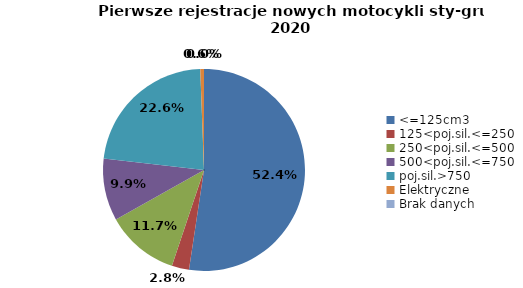
| Category | Series 0 |
|---|---|
| 0 | 11427 |
| 1 | 603 |
| 2 | 2557 |
| 3 | 2168 |
| 4 | 4931 |
| 5 | 129 |
| 6 | 0 |